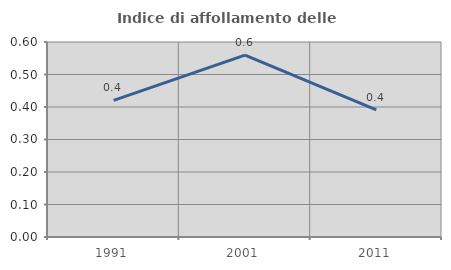
| Category | Indice di affollamento delle abitazioni  |
|---|---|
| 1991.0 | 0.42 |
| 2001.0 | 0.56 |
| 2011.0 | 0.391 |